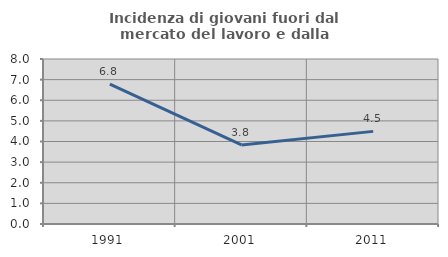
| Category | Incidenza di giovani fuori dal mercato del lavoro e dalla formazione  |
|---|---|
| 1991.0 | 6.78 |
| 2001.0 | 3.834 |
| 2011.0 | 4.491 |